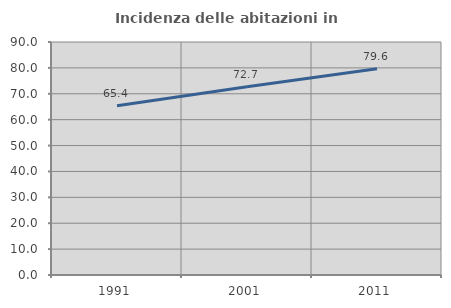
| Category | Incidenza delle abitazioni in proprietà  |
|---|---|
| 1991.0 | 65.403 |
| 2001.0 | 72.712 |
| 2011.0 | 79.642 |